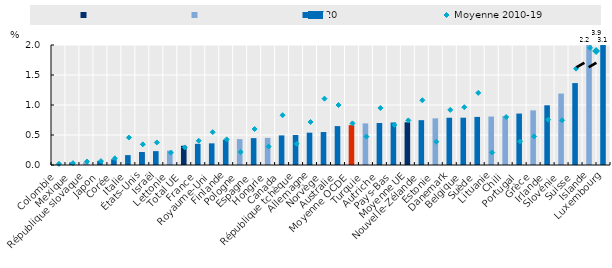
| Category | Series 1 | Series 0 | 2020 |
|---|---|---|---|
| Colombie | 0 | 0.015 | 0 |
| Mexique | 0 | 0 | 0.043 |
| République slovaque | 0 | 0.046 | 0 |
| Japon | 0 | 0 | 0.068 |
| Corée | 0 | 0 | 0.096 |
| Italie | 0 | 0 | 0.165 |
| États-Unis | 0.213 | 0 | 0.213 |
| Israël | 0 | 0 | 0.231 |
| Lettonie | 0 | 0.241 | 0 |
| Total UE | 0.321 | 0 | 0 |
| France | 0 | 0 | 0.353 |
| Royaume-Uni | 0 | 0 | 0.361 |
| Finlande | 0 | 0 | 0.42 |
| Pologne | 0 | 0.432 | 0 |
| Espagne | 0 | 0 | 0.448 |
| Hongrie | 0 | 0.452 | 0 |
| Canada | 0 | 0 | 0.493 |
| République tchèque | 0 | 0 | 0.5 |
| Allemagne | 0 | 0 | 0.539 |
| Norvège | 0 | 0 | 0.549 |
| Australie | 0 | 0 | 0.648 |
| Moyenne OCDE | 0.665 | 0 | 0 |
| Turquie | 0 | 0.693 | 0 |
| Autriche | 0 | 0 | 0.7 |
| Pays-Bas | 0 | 0 | 0.708 |
| Moyenne UE | 0.712 | 0 | 0 |
| Nouvelle-Zélande | 0 | 0 | 0.747 |
| Estonie | 0 | 0.778 | 0 |
| Danemark | 0 | 0 | 0.788 |
| Belgique | 0 | 0 | 0.788 |
| Suède | 0 | 0 | 0.801 |
| Lituanie | 0 | 0.808 | 0 |
| Chili | 0 | 0.815 | 0 |
| Portugal | 0 | 0 | 0.857 |
| Grèce | 0 | 0.911 | 0 |
| Irlande | 0 | 0 | 0.995 |
| Slovénie | 0 | 1.191 | 0 |
| Suisse | 0 | 0 | 1.365 |
| Islande | 0 | 2.23 | 0 |
| Luxembourg | 0 | 0 | 3.105 |